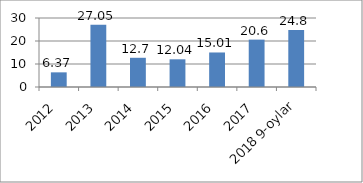
| Category | Series 0 |
|---|---|
| 2012 | 6.37 |
| 2013 | 27.05 |
| 2014 | 12.7 |
| 2015 | 12.04 |
| 2016 | 15.01 |
| 2017 | 20.6 |
| 2018 9-oylar | 24.8 |